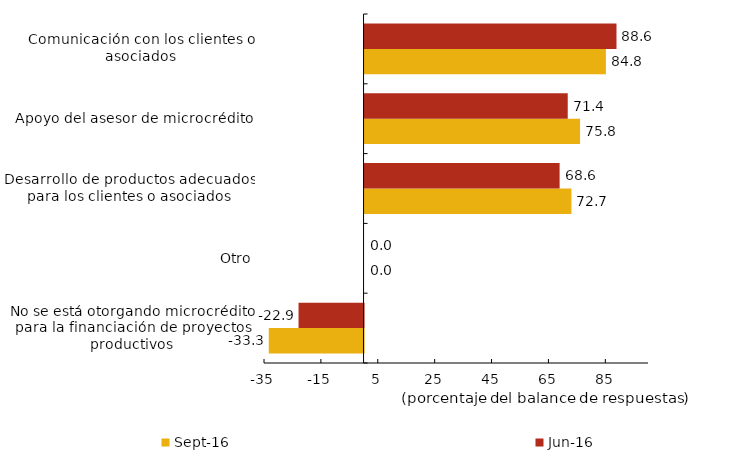
| Category | sep-16 | jun-16 |
|---|---|---|
| No se está otorgando microcrédito para la financiación de proyectos productivos | -33.333 | -22.857 |
| Otro | 0 | 0 |
| Desarrollo de productos adecuados para los clientes o asociados | 72.727 | 68.571 |
| Apoyo del asesor de microcrédito | 75.758 | 71.429 |
| Comunicación con los clientes o asociados | 84.848 | 88.571 |